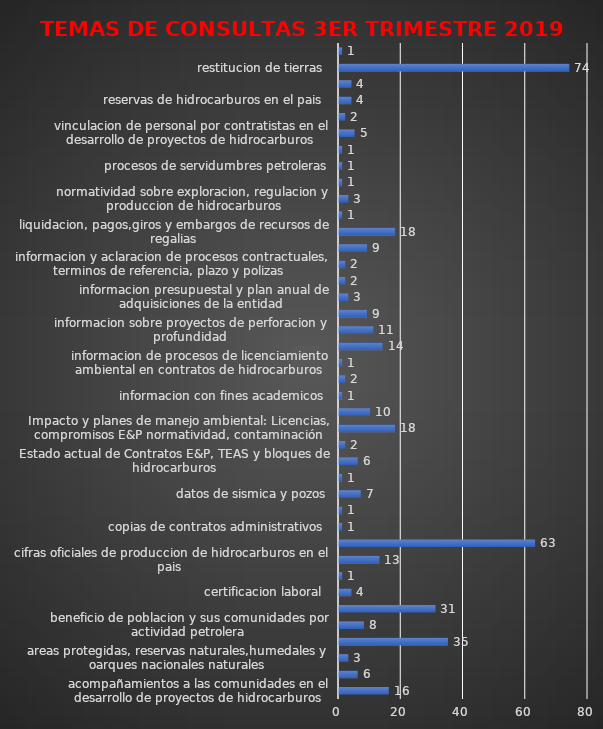
| Category | Series 0 |
|---|---|
| acompañamientos a las comunidades en el desarrollo de proyectos de hidrocarburos | 16 |
| asigancion de areas, areas libres, reglamentacion especial, requisitos y criterios para asignacion  | 6 |
| areas protegidas, reservas naturales,humedales y oarques nacionales naturales | 3 |
| asuntos de competencia de otra entidad  | 35 |
| beneficio de poblacion y sus comunidades por actividad petrolera  | 8 |
| cartografia de zonas petroleras | 31 |
| certificacion laboral  | 4 |
| certificaciones de actuaciones disciplinarias  | 1 |
| cifras oficiales de produccion de hidrocarburos en el pais  | 13 |
| Copias de contratos (E&P, TEAS y Administrativos) | 63 |
| copias de contratos administrativos  | 1 |
| comportamiento del mercado de hidrocarburos  | 1 |
| datos de sismica y pozos | 7 |
| declaracion de existencia de yacimiento petrolero | 1 |
| Estado actual de Contratos E&P, TEAS y bloques de hidrocarburos | 6 |
| FAEP montos girados  | 2 |
| Impacto y planes de manejo ambiental: Licencias, compromisos E&P normatividad, contaminación | 18 |
| Inconformidad por desarrollo irregular de proyecto | 10 |
| informacion con fines academicos  | 1 |
| informacion de operadores en colombia  | 2 |
| informacion de procesos de licenciamiento ambiental en contratos de hidrocarburos  | 1 |
| informacion sobre actos administrativos de la ANH | 14 |
| informacion sobre proyectos de perforacion y profundidad  | 11 |
| informacion sobre concursos y listas de elegibles  | 9 |
| informacion presupuestal y plan anual de adquisiciones de la entidad  | 3 |
| informacion sobre incumplimiento de contratos de hidrocarburos | 2 |
| informacion y aclaracion de procesos contractuales, terminos de referencia, plazo y polizas  | 2 |
| Intervención por no pago a subcontratistas por parte de Operadoras  | 9 |
| liquidacion, pagos,giros y embargos de recursos de regalias | 18 |
| mapa de areas  | 1 |
| normatividad sobre exploracion, regulacion y produccion de hidrocarburos | 3 |
| procesos de consultas previas con las comunidades en desarrollo de proyectos de hidrocarburos | 1 |
| procesos de servidumbres petroleras | 1 |
| proyectos y contratos de hidrocarburos en yacimientos no convencionales  | 1 |
| vinculacion de personal por contratistas en el desarrollo de proyectos de hidrocarburos  | 5 |
| Solicitud de información geológica y geofísica (sísmica y estatigrafía). | 2 |
| reservas de hidrocarburos en el pais  | 4 |
| quemas de gas en el sector de hidrocarburos | 4 |
| restitucion de tierras  | 74 |
| requerimientos de entes de control en el marco de auditoria e investigaciones especiales | 1 |